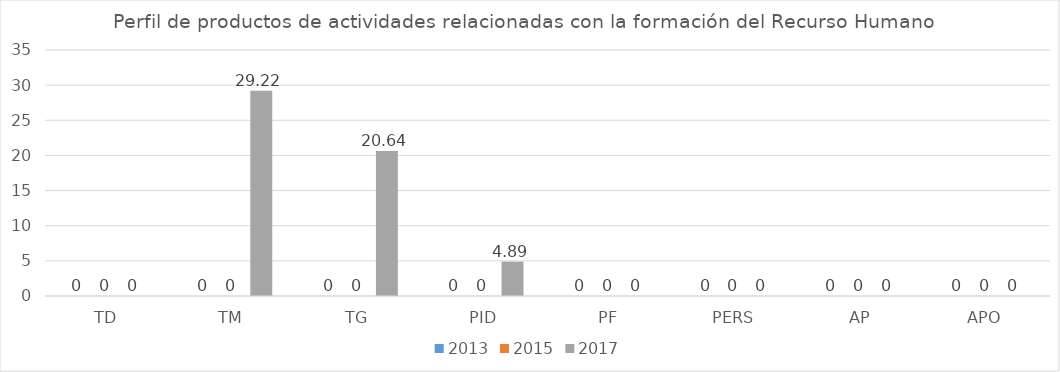
| Category | 2013 | 2015 | 2017 |
|---|---|---|---|
| TD | 0 | 0 | 0 |
| TM | 0 | 0 | 29.22 |
| TG | 0 | 0 | 20.64 |
| PID | 0 | 0 | 4.89 |
| PF | 0 | 0 | 0 |
| PERS | 0 | 0 | 0 |
| AP | 0 | 0 | 0 |
| APO | 0 | 0 | 0 |